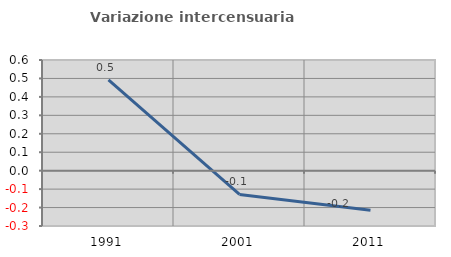
| Category | Variazione intercensuaria annua |
|---|---|
| 1991.0 | 0.492 |
| 2001.0 | -0.129 |
| 2011.0 | -0.215 |